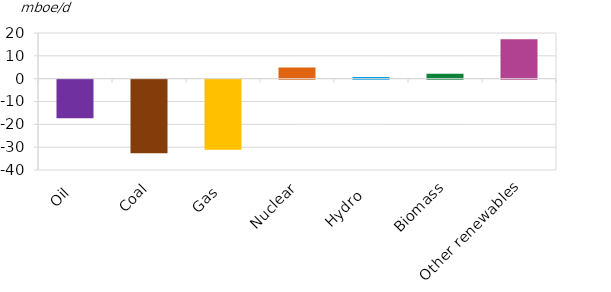
| Category | 2045 |
|---|---|
| Oil | -16.896 |
| Coal | -32.175 |
| Gas | -30.718 |
| Nuclear | 4.935 |
| Hydro  | 0.699 |
| Biomass | 2.194 |
| Other renewables | 17.237 |